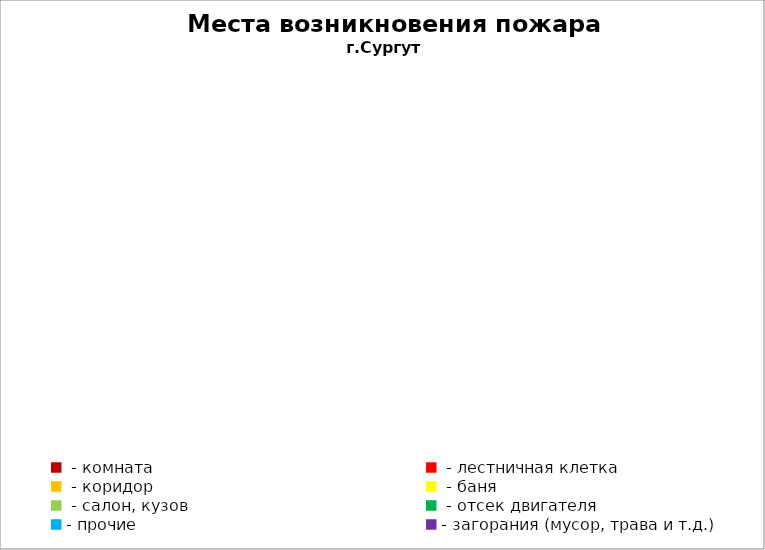
| Category | Места возникновения пожара |
|---|---|
|  - комната | 21 |
|  - лестничная клетка | 3 |
|  - коридор | 6 |
|  - баня | 12 |
|  - салон, кузов | 2 |
|  - отсек двигателя | 25 |
| - прочие | 33 |
| - загорания (мусор, трава и т.д.)  | 29 |